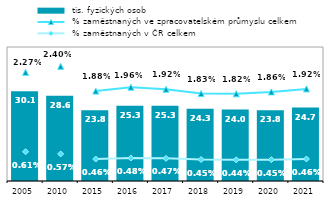
| Category |  tis. fyzických osob |
|---|---|
| 2005.0 | 30.105 |
| 2010.0 | 28.602 |
| 2015.0 | 23.771 |
| 2016.0 | 25.292 |
| 2017.0 | 25.298 |
| 2018.0 | 24.253 |
| 2019.0 | 24.001 |
| 2020.0 | 23.754 |
| 2021.0 | 24.677 |